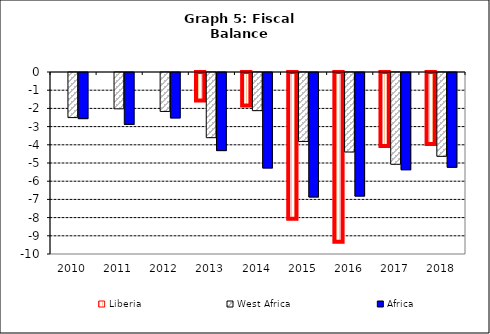
| Category | Liberia | West Africa | Africa |
|---|---|---|---|
| 2010.0 | 0 | -2.477 | -2.535 |
| 2011.0 | 0 | -1.995 | -2.853 |
| 2012.0 | 0 | -2.14 | -2.495 |
| 2013.0 | -1.616 | -3.581 | -4.291 |
| 2014.0 | -1.893 | -2.096 | -5.245 |
| 2015.0 | -8.118 | -3.788 | -6.84 |
| 2016.0 | -9.376 | -4.368 | -6.79 |
| 2017.0 | -4.117 | -5.043 | -5.342 |
| 2018.0 | -4.01 | -4.606 | -5.208 |